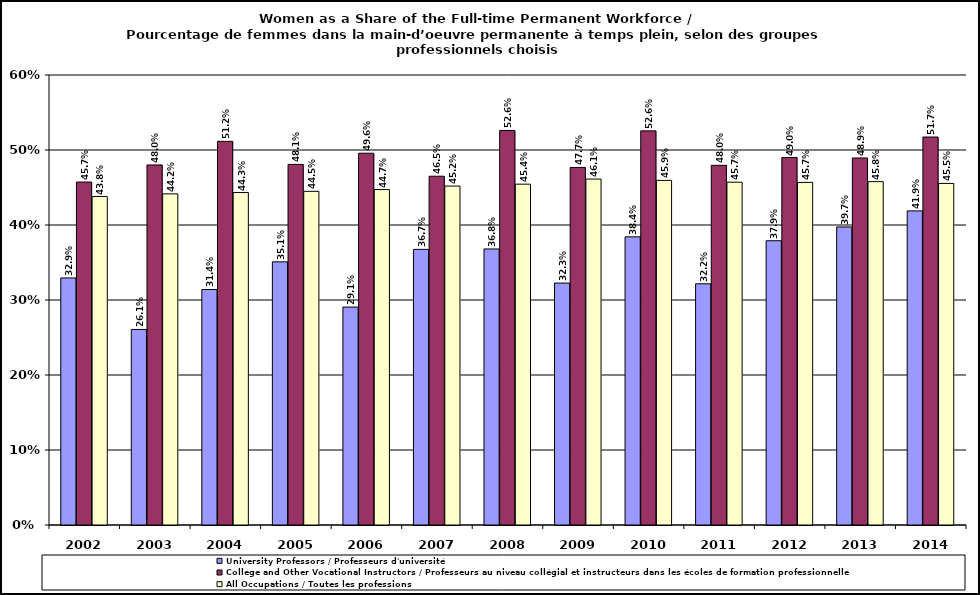
| Category | University Professors / Professeurs d'université | College and Other Vocational Instructors / Professeurs au niveau collégial et instructeurs dans les écoles de formation professionnelle  | All Occupations / Toutes les professions |
|---|---|---|---|
| 2002.0 | 0.329 | 0.457 | 0.438 |
| 2003.0 | 0.261 | 0.48 | 0.442 |
| 2004.0 | 0.314 | 0.512 | 0.443 |
| 2005.0 | 0.351 | 0.481 | 0.445 |
| 2006.0 | 0.291 | 0.496 | 0.447 |
| 2007.0 | 0.367 | 0.465 | 0.452 |
| 2008.0 | 0.368 | 0.526 | 0.454 |
| 2009.0 | 0.323 | 0.477 | 0.461 |
| 2010.0 | 0.384 | 0.526 | 0.459 |
| 2011.0 | 0.322 | 0.48 | 0.457 |
| 2012.0 | 0.379 | 0.49 | 0.457 |
| 2013.0 | 0.397 | 0.489 | 0.458 |
| 2014.0 | 0.419 | 0.517 | 0.455 |